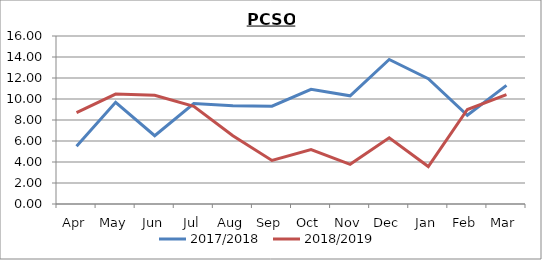
| Category | 2017/2018 | 2018/2019 |
|---|---|---|
| Apr | 5.49 | 8.7 |
| May | 9.69 | 10.47 |
| Jun | 6.5 | 10.35 |
| Jul | 9.56 | 9.3 |
| Aug | 9.36 | 6.5 |
| Sep | 9.31 | 4.15 |
| Oct | 10.92 | 5.19 |
| Nov | 10.3 | 3.78 |
| Dec | 13.76 | 6.3 |
| Jan | 11.94 | 3.57 |
| Feb | 8.45 | 9 |
| Mar | 11.3 | 10.42 |